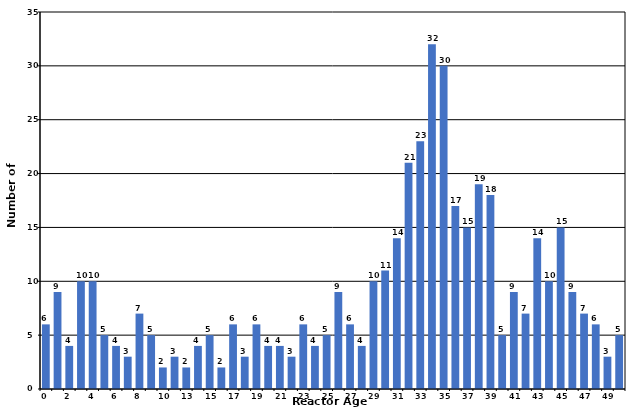
| Category | Age |
|---|---|
| 0.0 | 6 |
| 1.0 | 9 |
| 2.0 | 4 |
| 3.0 | 10 |
| 4.0 | 10 |
| 5.0 | 5 |
| 6.0 | 4 |
| 7.0 | 3 |
| 8.0 | 7 |
| 9.0 | 5 |
| 10.0 | 2 |
| 12.0 | 3 |
| 13.0 | 2 |
| 14.0 | 4 |
| 15.0 | 5 |
| 16.0 | 2 |
| 17.0 | 6 |
| 18.0 | 3 |
| 19.0 | 6 |
| 20.0 | 4 |
| 21.0 | 4 |
| 22.0 | 3 |
| 23.0 | 6 |
| 24.0 | 4 |
| 25.0 | 5 |
| 26.0 | 9 |
| 27.0 | 6 |
| 28.0 | 4 |
| 29.0 | 10 |
| 30.0 | 11 |
| 31.0 | 14 |
| 32.0 | 21 |
| 33.0 | 23 |
| 34.0 | 32 |
| 35.0 | 30 |
| 36.0 | 17 |
| 37.0 | 15 |
| 38.0 | 19 |
| 39.0 | 18 |
| 40.0 | 5 |
| 41.0 | 9 |
| 42.0 | 7 |
| 43.0 | 14 |
| 44.0 | 10 |
| 45.0 | 15 |
| 46.0 | 9 |
| 47.0 | 7 |
| 48.0 | 6 |
| 49.0 | 3 |
| 50.0 | 5 |